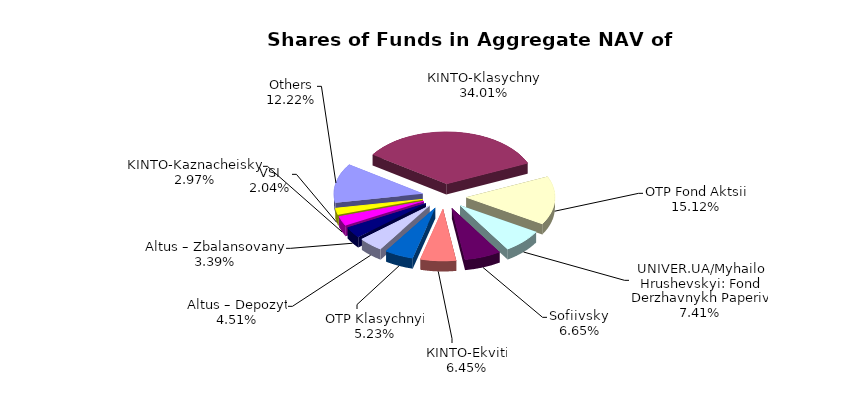
| Category | Series 0 | Series 1 |
|---|---|---|
| Others | 11229931.57 | 0.129 |
| КІNТО-Klasychnyi | 31263070.26 | 0.358 |
| ОТP Fond Aktsii | 13898566.24 | 0.159 |
| UNIVER.UA/Myhailo Hrushevskyi: Fond Derzhavnykh Paperiv | 6811123.52 | 0.078 |
| Sofiivskyi | 6107591.43 | 0.07 |
| КІNTO-Ekviti | 5927079.07 | 0.068 |
| ОТP Klasychnyi | 4809233.83 | 0.055 |
| Altus – Depozyt | 4146952.94 | 0.047 |
| Altus – Zbalansovanyi | 3111635.19 | 0.036 |
| KINTO-Kaznacheiskyi | 2730512 | 0.031 |
| VSI | 1873986.86 | 0.021 |